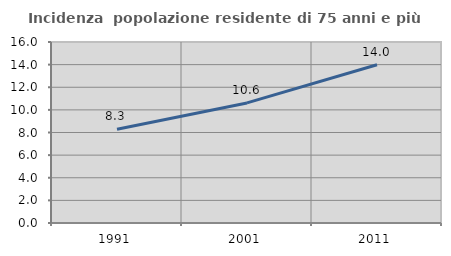
| Category | Incidenza  popolazione residente di 75 anni e più |
|---|---|
| 1991.0 | 8.294 |
| 2001.0 | 10.615 |
| 2011.0 | 13.983 |